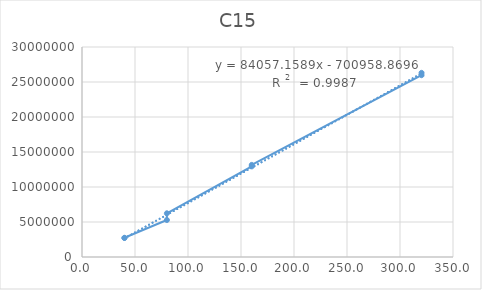
| Category | Series 0 |
|---|---|
| 40.04076878276063 | 2743947 |
| 40.04076878276063 | 2714058 |
| 80.08153756552126 | 5283011 |
| 80.08153756552126 | 6241683 |
| 160.16307513104252 | 12944246 |
| 160.16307513104252 | 13159036 |
| 320.32615026208504 | 25969990 |
| 320.32615026208504 | 26307756 |